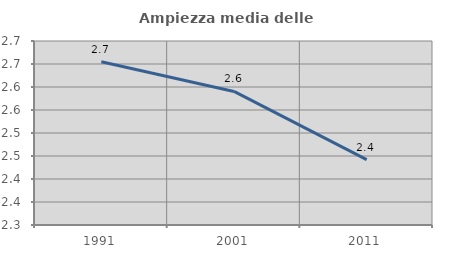
| Category | Ampiezza media delle famiglie |
|---|---|
| 1991.0 | 2.655 |
| 2001.0 | 2.59 |
| 2011.0 | 2.442 |